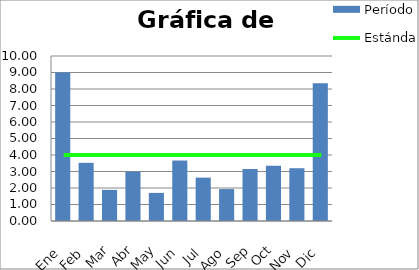
| Category | Período |
|---|---|
| Ene | 9 |
| Feb | 3.526 |
| Mar | 1.886 |
| Abr | 2.994 |
| May | 1.703 |
| Jun | 3.665 |
| Jul | 2.629 |
| Ago | 1.935 |
| Sep | 3.15 |
| Oct | 3.35 |
| Nov | 3.198 |
| Dic | 8.349 |